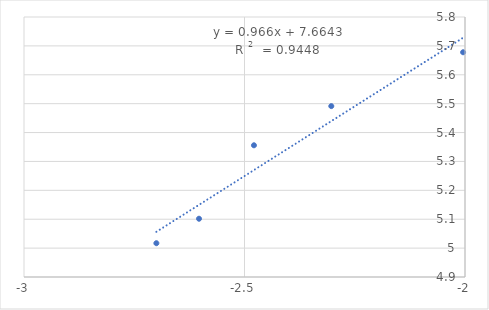
| Category | Series 0 |
|---|---|
| -2.0043213737826426 | 5.678 |
| -2.303196057420489 | 5.492 |
| -2.4785664955938436 | 5.356 |
| -2.603144372620182 | 5.102 |
| -2.699837725867246 | 5.017 |